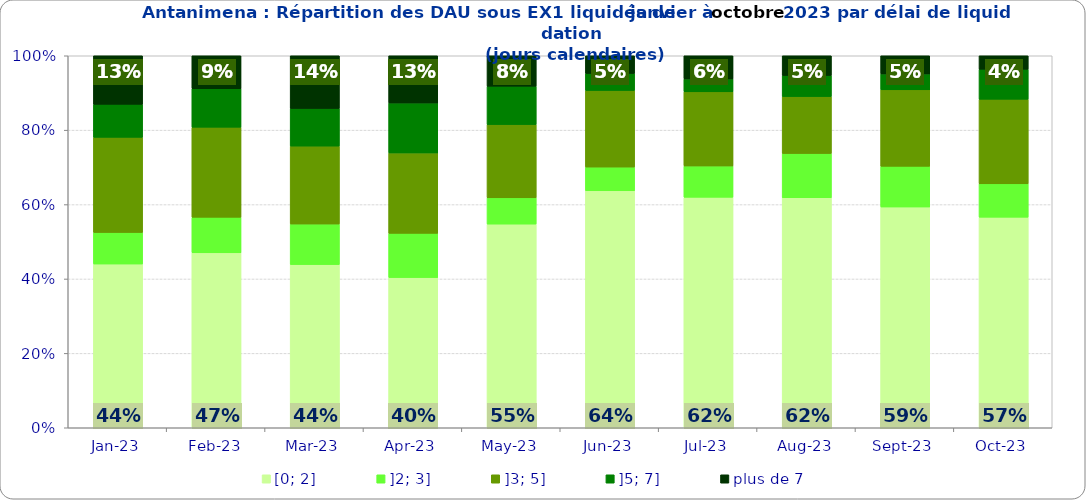
| Category | [0; 2] | ]2; 3] | ]3; 5] | ]5; 7] | plus de 7 |
|---|---|---|---|---|---|
| 2023-01-01 | 0.44 | 0.085 | 0.256 | 0.089 | 0.131 |
| 2023-02-01 | 0.47 | 0.096 | 0.242 | 0.103 | 0.089 |
| 2023-03-01 | 0.439 | 0.109 | 0.209 | 0.101 | 0.142 |
| 2023-04-01 | 0.404 | 0.119 | 0.216 | 0.134 | 0.127 |
| 2023-05-01 | 0.547 | 0.071 | 0.197 | 0.103 | 0.082 |
| 2023-06-01 | 0.637 | 0.064 | 0.206 | 0.046 | 0.047 |
| 2023-07-01 | 0.62 | 0.084 | 0.199 | 0.035 | 0.062 |
| 2023-08-01 | 0.618 | 0.119 | 0.153 | 0.057 | 0.053 |
| 2023-09-01 | 0.593 | 0.109 | 0.206 | 0.043 | 0.049 |
| 2023-10-01 | 0.566 | 0.09 | 0.227 | 0.081 | 0.036 |